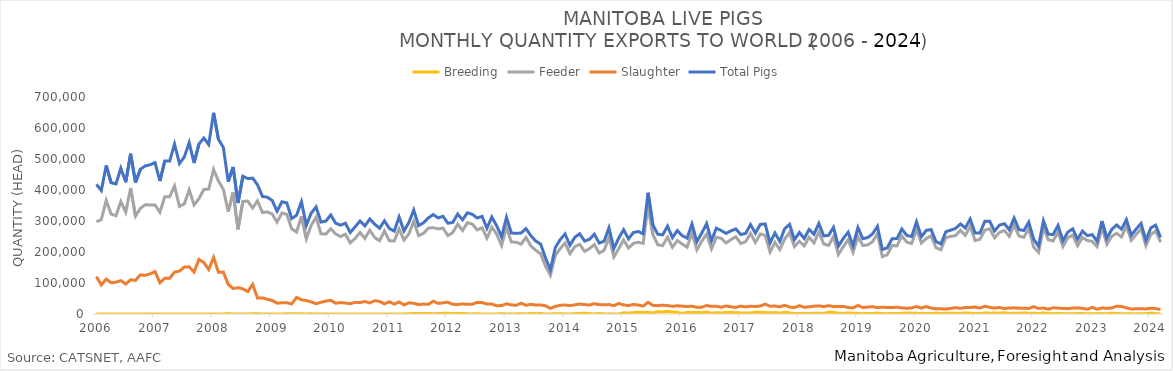
| Category | Breeding | Feeder | Slaughter | Total Pigs |
|---|---|---|---|---|
| 2006-01-01 | 0 | 297447 | 120678 | 418125 |
| 2006-02-01 | 0 | 304391 | 93850 | 398241 |
| 2006-03-01 | 0 | 366922 | 112463 | 479385 |
| 2006-04-01 | 0 | 322576 | 101014 | 423590 |
| 2006-05-01 | 63 | 316770 | 102650 | 419483 |
| 2006-06-01 | 0 | 362766 | 107709 | 470475 |
| 2006-07-01 | 30 | 328287 | 96732 | 425049 |
| 2006-08-01 | 0 | 406543 | 110414 | 516957 |
| 2006-09-01 | 33 | 315905 | 108424 | 424362 |
| 2006-10-01 | 0 | 340597 | 126430 | 467027 |
| 2006-11-01 | 440 | 352593 | 124639 | 477672 |
| 2006-12-01 | 165 | 351560 | 129659 | 481384 |
| 2007-01-01 | 0 | 351636 | 136779 | 488415 |
| 2007-02-01 | 0 | 328388 | 100616 | 429004 |
| 2007-03-01 | 35 | 378236 | 115256 | 493527 |
| 2007-04-01 | 0 | 377961 | 115205 | 493166 |
| 2007-05-01 | 0 | 412787 | 135126 | 547913 |
| 2007-06-01 | 257 | 346964 | 138235 | 485456 |
| 2007-07-01 | 0 | 355162 | 151386 | 506548 |
| 2007-08-01 | 68 | 400449 | 152234 | 552751 |
| 2007-09-01 | 0 | 351861 | 135181 | 487042 |
| 2007-10-01 | 263 | 371849 | 176091 | 548203 |
| 2007-11-01 | 239 | 401520 | 166018 | 567777 |
| 2007-12-01 | 0 | 402997 | 143666 | 546663 |
| 2008-01-01 | 0 | 466316 | 182589 | 648905 |
| 2008-02-01 | 0 | 428897 | 134458 | 563355 |
| 2008-03-01 | 0 | 401888 | 135245 | 537133 |
| 2008-04-01 | 1308 | 330161 | 95526 | 426995 |
| 2008-05-01 | 10 | 391884 | 82110 | 474004 |
| 2008-06-01 | 181 | 272987 | 84908 | 358076 |
| 2008-07-01 | 48 | 363040 | 81178 | 444266 |
| 2008-08-01 | 9 | 364445 | 72348 | 436802 |
| 2008-09-01 | 732 | 341870 | 95682 | 438284 |
| 2008-10-01 | 597 | 364940 | 51212 | 416749 |
| 2008-11-01 | 60 | 327367 | 52035 | 379462 |
| 2008-12-01 | 0 | 329377 | 47489 | 376866 |
| 2009-01-01 | 36 | 322492 | 43630 | 366158 |
| 2009-02-01 | 0 | 296571 | 34952 | 331523 |
| 2009-03-01 | 0 | 325809 | 36157 | 361966 |
| 2009-04-01 | 652 | 321444 | 36235 | 358331 |
| 2009-05-01 | 661 | 274610 | 32696 | 307967 |
| 2009-06-01 | 860 | 264404 | 53393 | 318657 |
| 2009-07-01 | 699 | 315574 | 45875 | 362148 |
| 2009-08-01 | 0 | 242617 | 43660 | 286277 |
| 2009-09-01 | 699 | 286274 | 38650 | 325623 |
| 2009-10-01 | 0 | 312087 | 33133 | 345220 |
| 2009-11-01 | 0 | 258838 | 37849 | 296687 |
| 2009-12-01 | 464 | 257739 | 41527 | 299730 |
| 2010-01-01 | 62 | 275147 | 44302 | 319511 |
| 2010-02-01 | 0 | 258355 | 34629 | 292984 |
| 2010-03-01 | 40 | 249785 | 36781 | 286606 |
| 2010-04-01 | 0 | 257609 | 35324 | 292933 |
| 2010-05-01 | 0 | 229478 | 33339 | 262817 |
| 2010-06-01 | 144 | 243571 | 37670 | 281385 |
| 2010-07-01 | 97 | 263197 | 36819 | 300113 |
| 2010-08-01 | 30 | 243831 | 40177 | 284038 |
| 2010-09-01 | 175 | 270570 | 35800 | 306545 |
| 2010-10-01 | 0 | 246989 | 42901 | 289890 |
| 2010-11-01 | 0 | 236223 | 40496 | 276719 |
| 2010-12-01 | 348 | 267674 | 32633 | 300655 |
| 2011-01-01 | 0 | 236500 | 39465 | 275965 |
| 2011-02-01 | 0 | 235276 | 31935 | 267211 |
| 2011-03-01 | 0 | 274140 | 38928 | 313068 |
| 2011-04-01 | 0 | 238718 | 29365 | 268083 |
| 2011-05-01 | 987 | 257985 | 35940 | 294912 |
| 2011-06-01 | 1735 | 298761 | 34802 | 335298 |
| 2011-07-01 | 1993 | 252776 | 30144 | 284913 |
| 2011-08-01 | 1885 | 260143 | 32111 | 294139 |
| 2011-09-01 | 2013 | 277012 | 31053 | 310078 |
| 2011-10-01 | 930 | 278428 | 41320 | 320678 |
| 2011-11-01 | 1240 | 274643 | 34145 | 310028 |
| 2011-12-01 | 2098 | 277042 | 36004 | 315144 |
| 2012-01-01 | 2134 | 252762 | 37965 | 292861 |
| 2012-02-01 | 974 | 263000 | 31278 | 295252 |
| 2012-03-01 | 2089 | 289812 | 30453 | 322354 |
| 2012-04-01 | 1912 | 269349 | 32556 | 303817 |
| 2012-05-01 | 425 | 294715 | 31274 | 326414 |
| 2012-06-01 | 262 | 289892 | 31360 | 321514 |
| 2012-07-01 | 827 | 271315 | 37552 | 309694 |
| 2012-08-01 | 0 | 278187 | 36849 | 315036 |
| 2012-09-01 | 0 | 244457 | 32154 | 276611 |
| 2012-10-01 | 313 | 280204 | 32286 | 312803 |
| 2012-11-01 | 0 | 257694 | 26543 | 284237 |
| 2012-12-01 | 987 | 220775 | 27409 | 249171 |
| 2013-01-01 | 0 | 279253 | 32839 | 312092 |
| 2013-02-01 | 30 | 232147 | 29209 | 261386 |
| 2013-03-01 | 110 | 231593 | 28348 | 260051 |
| 2013-04-01 | 1256 | 225444 | 34698 | 261398 |
| 2013-05-01 | 0 | 247243 | 28142 | 275385 |
| 2013-06-01 | 2302 | 219361 | 30939 | 252602 |
| 2013-07-01 | 487 | 205628 | 29121 | 235236 |
| 2013-08-01 | 1895 | 194278 | 29382 | 225555 |
| 2013-09-01 | 0 | 154378 | 26420 | 180798 |
| 2013-10-01 | 121 | 124748 | 18226 | 143095 |
| 2013-11-01 | 940 | 188326 | 24684 | 213950 |
| 2013-12-01 | 1073 | 210876 | 27900 | 239849 |
| 2014-01-01 | 56 | 228971 | 29151 | 258178 |
| 2014-02-01 | 33 | 194567 | 27073 | 221673 |
| 2014-03-01 | 886 | 217092 | 29492 | 247470 |
| 2014-04-01 | 1859 | 224814 | 32133 | 258806 |
| 2014-05-01 | 2678 | 202096 | 30468 | 235242 |
| 2014-06-01 | 1234 | 210854 | 28858 | 240946 |
| 2014-07-01 | 0 | 224106 | 33211 | 257317 |
| 2014-08-01 | 1979 | 196569 | 30288 | 228836 |
| 2014-09-01 | 21 | 205157 | 29686 | 234864 |
| 2014-10-01 | 468 | 247019 | 30536 | 278023 |
| 2014-11-01 | 110 | 184265 | 26869 | 211244 |
| 2014-12-01 | 200 | 210657 | 33884 | 244741 |
| 2015-01-01 | 3581 | 239138 | 29273 | 271992 |
| 2015-02-01 | 2670 | 212684 | 27004 | 242358 |
| 2015-03-01 | 4363 | 227497 | 30897 | 262757 |
| 2015-04-01 | 5794 | 231501 | 28838 | 266133 |
| 2015-05-01 | 5207 | 227838 | 25498 | 258543 |
| 2015-06-01 | 5111 | 348378 | 37580 | 391069 |
| 2015-07-01 | 3245 | 256363 | 27930 | 287538 |
| 2015-08-01 | 7088 | 223155 | 26934 | 257177 |
| 2015-09-01 | 6413 | 220516 | 28565 | 255494 |
| 2015-10-01 | 8664 | 247636 | 27156 | 283456 |
| 2015-11-01 | 6273 | 215339 | 24673 | 246285 |
| 2015-12-01 | 5483 | 237007 | 26660 | 269150 |
| 2016-01-01 | 1573 | 225750 | 25277 | 252600 |
| 2016-02-01 | 4961 | 215662 | 24101 | 244724 |
| 2016-03-01 | 4529 | 260893 | 25171 | 290593 |
| 2016-04-01 | 5167 | 206829 | 21381 | 233377 |
| 2016-05-01 | 4244 | 234384 | 21888 | 260516 |
| 2016-06-01 | 5815 | 258167 | 27363 | 291345 |
| 2016-07-01 | 2386 | 210143 | 24466 | 236995 |
| 2016-08-01 | 4247 | 247423 | 25060 | 276730 |
| 2016-09-01 | 3276 | 244027 | 21782 | 269085 |
| 2016-10-01 | 4988 | 229041 | 26003 | 260032 |
| 2016-11-01 | 5256 | 240172 | 22931 | 268359 |
| 2016-12-01 | 3880 | 249114 | 21487 | 274481 |
| 2017-01-01 | 3585 | 227127 | 25537 | 256249 |
| 2017-02-01 | 3533 | 233500 | 22953 | 259986 |
| 2017-03-01 | 3367 | 260128 | 24883 | 288378 |
| 2017-04-01 | 5469 | 230970 | 24316 | 260755 |
| 2017-05-01 | 5162 | 258301 | 25618 | 289081 |
| 2017-06-01 | 4612 | 254057 | 31796 | 290465 |
| 2017-07-01 | 3993 | 200078 | 25128 | 229199 |
| 2017-08-01 | 4536 | 231045 | 25768 | 261349 |
| 2017-09-01 | 3131 | 207930 | 23146 | 234207 |
| 2017-10-01 | 5250 | 241845 | 28111 | 275206 |
| 2017-11-01 | 3557 | 263125 | 22318 | 289000 |
| 2017-12-01 | 1418 | 217350 | 21017 | 239785 |
| 2018-01-01 | 1726 | 234540 | 26851 | 263117 |
| 2018-02-01 | 2092 | 219751 | 21825 | 243668 |
| 2018-03-01 | 1599 | 247712 | 23353 | 272664 |
| 2018-04-01 | 2616 | 229472 | 25173 | 257261 |
| 2018-05-01 | 2253 | 263874 | 26278 | 292405 |
| 2018-06-01 | 1777 | 225963 | 23951 | 251691 |
| 2018-07-01 | 5712 | 221256 | 26878 | 253846 |
| 2018-08-01 | 5107 | 249988 | 24314 | 279409 |
| 2018-09-01 | 2754 | 191942 | 24093 | 218789 |
| 2018-10-01 | 1868 | 217135 | 24599 | 243602 |
| 2018-11-01 | 3425 | 239317 | 21023 | 263765 |
| 2018-12-01 | 2206 | 198839 | 19657 | 220702 |
| 2019-01-01 | 1957 | 249240 | 27672 | 278869 |
| 2019-02-01 | 996 | 221029 | 20901 | 242926 |
| 2019-03-01 | 1396 | 222820 | 22309 | 246525 |
| 2019-04-01 | 1550 | 233191 | 23796 | 258537 |
| 2019-05-01 | 3113 | 259184 | 20498 | 282795 |
| 2019-06-01 | 1169 | 185102 | 21836 | 208107 |
| 2019-07-01 | 1163 | 191043 | 21047 | 213253 |
| 2019-08-01 | 1379 | 221025 | 20550 | 242954 |
| 2019-09-01 | 1420 | 219735 | 22066 | 243221 |
| 2019-10-01 | 2221 | 252254 | 19734 | 274209 |
| 2019-11-01 | 3388 | 231735 | 18529 | 253652 |
| 2019-12-01 | 2694 | 227411 | 19702 | 249807 |
| 2020-01-01 | 2156 | 271277 | 24020 | 297453 |
| 2020-02-01 | 1286 | 228885 | 19009 | 249180 |
| 2020-03-01 | 2047 | 243683 | 24133 | 269863 |
| 2020-04-01 | 1075 | 252104 | 19051 | 272230 |
| 2020-05-01 | 2930 | 213820 | 16692 | 233442 |
| 2020-06-01 | 1578 | 207298 | 16776 | 225652 |
| 2020-07-01 | 2831 | 246440 | 15937 | 265208 |
| 2020-08-01 | 2155 | 250357 | 17927 | 270439 |
| 2020-09-01 | 2664 | 252944 | 20435 | 276043 |
| 2020-10-01 | 1916 | 270241 | 18300 | 290457 |
| 2020-11-01 | 3241 | 253407 | 20821 | 277469 |
| 2020-12-01 | 2138 | 283003 | 21192 | 306333 |
| 2021-01-01 | 1864 | 236861 | 22467 | 261192 |
| 2021-02-01 | 1522 | 240885 | 19141 | 261548 |
| 2021-03-01 | 3149 | 270694 | 25029 | 298872 |
| 2021-04-01 | 2719 | 274813 | 21643 | 299175 |
| 2021-05-01 | 2980 | 245929 | 18958 | 267867 |
| 2021-06-01 | 2532 | 263060 | 21162 | 286754 |
| 2021-07-01 | 4087 | 269667 | 17495 | 291249 |
| 2021-08-01 | 1703 | 250653 | 19566 | 271922 |
| 2021-09-01 | 2829 | 286739 | 19847 | 309415 |
| 2021-10-01 | 1892 | 251273 | 18994 | 272159 |
| 2021-11-01 | 3315 | 247501 | 18628 | 269444 |
| 2021-12-01 | 2551 | 275791 | 17953 | 296295 |
| 2022-01-01 | 2276 | 215666 | 23698 | 241640 |
| 2022-02-01 | 1545 | 198800 | 17871 | 218216 |
| 2022-03-01 | 3238 | 278105 | 19352 | 300695 |
| 2022-04-01 | 1797 | 239587 | 15614 | 256998 |
| 2022-05-01 | 882 | 235756 | 20057 | 256695 |
| 2022-06-01 | 1929 | 264401 | 19317 | 285647 |
| 2022-07-01 | 1049 | 217646 | 17760 | 236455 |
| 2022-08-01 | 850 | 246124 | 17360 | 264334 |
| 2022-09-01 | 1136 | 254465 | 19188 | 274789 |
| 2022-10-01 | 1207 | 220249 | 19360 | 240816 |
| 2022-11-01 | 2104 | 246798 | 18589 | 267491 |
| 2022-12-01 | 435 | 236908 | 15413 | 252756 |
| 2023-01-01 | 655 | 234055 | 21388 | 256098 |
| 2023-02-01 | 1140 | 217626 | 15572 | 234338 |
| 2023-03-01 | 1276 | 279038 | 19347 | 299661 |
| 2023-04-01 | 768 | 225078 | 18183 | 244029 |
| 2023-05-01 | 2752 | 250458 | 19502 | 272712 |
| 2023-06-01 | 1589 | 260396 | 25169 | 287154 |
| 2023-07-01 | 747 | 248621 | 24225 | 273593 |
| 2023-08-01 | 848 | 283457 | 20039 | 304344 |
| 2023-09-01 | 543 | 237668 | 15907 | 254118 |
| 2023-10-01 | 269 | 256579 | 17184 | 274032 |
| 2023-11-01 | 944 | 274325 | 16813 | 292082 |
| 2023-12-01 | 1075 | 220364 | 16295 | 237734 |
| 2024-01-01 | 2978 | 256107 | 18753 | 277838 |
| 2024-02-01 | 1165 | 268010 | 17365 | 286540 |
| 2024-03-01 | 1149 | 231259 | 14588 | 246996 |